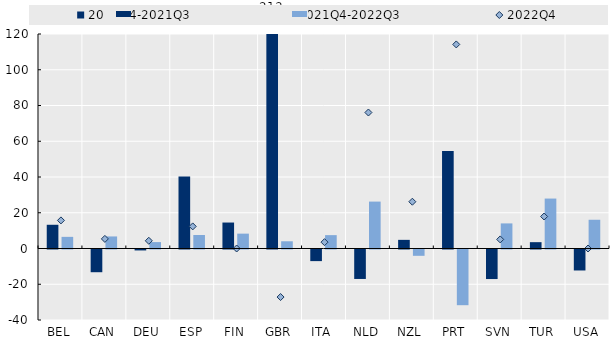
| Category | 2020Q4-2021Q3 | 2021Q4-2022Q3 |
|---|---|---|
| BEL | 13.273 | 6.513 |
| CAN | -12.71 | 6.745 |
| DEU | -0.524 | 3.587 |
| ESP | 40.219 | 7.561 |
| FIN | 14.525 | 8.311 |
| GBR | 213.416 | 4.041 |
| ITA | -6.498 | 7.479 |
| NLD | -16.484 | 26.243 |
| NZL | 4.836 | -3.531 |
| PRT | 54.592 | -31.16 |
| SVN | -16.526 | 14.039 |
| TUR | 3.544 | 27.937 |
| USA | -11.735 | 16.078 |